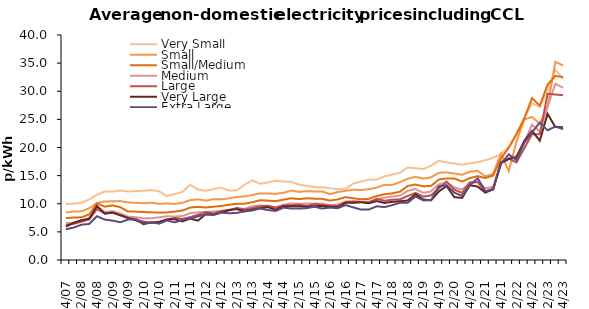
| Category | Very Small | Small | Small/Medium | Medium | Large | Very Large | Extra Large |
|---|---|---|---|---|---|---|---|
| Q4/07  | 9.933 | 8.438 | 7.454 | 6.574 | 6.184 | 5.956 | 5.476 |
| Q1/08  | 10.021 | 8.605 | 7.549 | 6.615 | 6.438 | 6.609 | 5.766 |
| Q2/08  | 10.173 | 8.651 | 7.588 | 7.026 | 6.809 | 7.068 | 6.275 |
| Q3/08  | 10.758 | 9.199 | 8.096 | 7.475 | 7.214 | 7.329 | 6.405 |
| Q4/08  | 11.603 | 10.126 | 10.065 | 9.495 | 9.032 | 9.582 | 7.785 |
| Q1/09  | 12.185 | 10.413 | 9.486 | 8.537 | 8.293 | 8.235 | 7.18 |
| Q2/09  | 12.177 | 10.43 | 9.697 | 8.672 | 8.45 | 8.422 | 7.002 |
| Q3/09  | 12.352 | 10.476 | 9.395 | 8.271 | 7.943 | 7.973 | 6.712 |
| Q4/09  | 12.183 | 10.22 | 8.617 | 7.713 | 7.479 | 7.469 | 7.181 |
| Q1/10  | 12.259 | 10.171 | 8.6 | 7.597 | 7.258 | 7.055 | 7.245 |
| Q2/10  | 12.301 | 10.091 | 8.524 | 7.412 | 6.803 | 6.511 | 6.333 |
| Q3/10  | 12.424 | 10.175 | 8.478 | 7.433 | 6.676 | 6.615 | 6.713 |
| Q4/10  | 12.228 | 9.99 | 8.435 | 7.576 | 6.761 | 6.768 | 6.461 |
| Q1/11  | 11.359 | 10.055 | 8.458 | 7.77 | 7.15 | 7.222 | 7.024 |
| Q2/11  | 11.741 | 9.97 | 8.612 | 7.737 | 7.481 | 7.25 | 6.695 |
| Q3/11  | 12.114 | 10.168 | 8.792 | 7.809 | 7.323 | 6.863 | 7.114 |
| Q4/11  | 13.371 | 10.64 | 9.32 | 8.335 | 7.624 | 7.357 | 7.388 |
| Q1/12  | 12.541 | 10.784 | 9.448 | 8.462 | 8.023 | 7.001 | 7.761 |
| Q2/12  | 12.29 | 10.551 | 9.341 | 8.527 | 8.55 | 8.156 | 8.083 |
| Q3/12  | 12.617 | 10.804 | 9.476 | 8.621 | 8.259 | 8.079 | 7.993 |
| Q4/12  | 12.852 | 10.803 | 9.604 | 8.777 | 8.665 | 8.446 | 8.426 |
| Q1/13  | 12.346 | 10.954 | 9.824 | 8.93 | 8.801 | 8.894 | 8.311 |
| Q2/13  | 12.379 | 11.208 | 10.012 | 9.131 | 9.266 | 9.038 | 8.378 |
| Q3/13  | 13.403 | 11.3 | 9.987 | 9.104 | 8.985 | 8.672 | 8.634 |
| Q4/13  | 14.157 | 11.562 | 10.287 | 9.551 | 9.209 | 8.942 | 8.808 |
| Q1/14  | 13.554 | 11.839 | 10.625 | 9.705 | 9.553 | 9.203 | 9.159 |
| Q2/14  | 13.778 | 11.83 | 10.554 | 9.555 | 9.648 | 9.391 | 8.867 |
| Q3/14  | 14.077 | 11.763 | 10.457 | 9.414 | 9.294 | 8.935 | 8.718 |
| Q4/14  | 13.961 | 11.941 | 10.722 | 9.789 | 9.689 | 9.549 | 9.31 |
| Q1/15  | 13.901 | 12.35 | 10.978 | 10.076 | 9.732 | 9.555 | 9.157 |
| Q2/15  | 13.407 | 12.102 | 10.823 | 9.995 | 9.842 | 9.545 | 9.133 |
| Q3/15  | 13.189 | 12.237 | 10.965 | 10.041 | 9.601 | 9.475 | 9.23 |
| Q4/15  | 12.963 | 12.177 | 10.909 | 10.049 | 9.951 | 9.573 | 9.463 |
| Q1/16  | 12.937 | 12.183 | 10.871 | 10.005 | 9.792 | 9.593 | 9.151 |
| Q2/16  | 12.755 | 11.714 | 10.565 | 9.718 | 9.672 | 9.445 | 9.314 |
| Q3/16  | 12.584 | 12.095 | 10.768 | 9.884 | 9.603 | 9.408 | 9.214 |
| Q4/16  | 12.689 | 12.297 | 11.173 | 10.412 | 10.261 | 10.164 | 9.759 |
| Q1/17  | 13.604 | 12.502 | 10.976 | 10.462 | 10.352 | 10.17 | 9.35 |
| Q2/17  | 13.928 | 12.436 | 10.784 | 10.311 | 10.329 | 10.257 | 8.957 |
| Q3/17  | 14.302 | 12.593 | 10.875 | 10.368 | 10.2 | 10.098 | 8.97 |
| Q4/17  | 14.274 | 12.863 | 11.363 | 10.796 | 10.876 | 10.469 | 9.548 |
| Q1/18  | 14.872 | 13.357 | 11.695 | 11.084 | 10.524 | 10.14 | 9.405 |
| Q2/18  | 15.2 | 13.328 | 11.845 | 11.286 | 10.728 | 10.34 | 9.745 |
| Q3/18  | 15.515 | 13.841 | 12.134 | 11.445 | 10.777 | 10.432 | 10.177 |
| Q4/18  | 16.445 | 14.444 | 13.176 | 12.306 | 11.383 | 10.584 | 10.186 |
| Q1/19  | 16.327 | 14.798 | 13.418 | 12.61 | 11.926 | 11.703 | 11.298 |
| Q2/19  | 16.156 | 14.485 | 13.096 | 11.947 | 11.27 | 10.755 | 10.596 |
| Q3/19  | 16.767 | 14.698 | 13.18 | 12.195 | 11.494 | 10.611 | 10.612 |
| Q4/19  | 17.648 | 15.512 | 14.302 | 13.453 | 12.727 | 12.175 | 13.106 |
| Q1/20  | 17.342 | 15.58 | 14.509 | 13.795 | 13.947 | 13.159 | 13.303 |
| Q2/20  | 17.143 | 15.385 | 14.506 | 12.886 | 12.506 | 11.166 | 11.975 |
| Q3/20  | 16.937 | 15.146 | 13.951 | 12.528 | 11.93 | 11.042 | 11.383 |
| Q4/20  | 17.172 | 15.7 | 14.562 | 13.712 | 13.813 | 13.294 | 13.307 |
| Q1/21  | 17.414 | 15.845 | 14.909 | 13.843 | 13.857 | 13.048 | 14.529 |
| Q2/21  | 17.743 | 14.854 | 14.574 | 12.717 | 12.085 | 11.967 | 12.227 |
| Q3/21  | 18.176 | 15.331 | 15.017 | 13.043 | 12.501 | 12.64 | 12.653 |
| Q4/21  | 18.843 | 18.893 | 18.042 | 17.219 | 17.439 | 17.219 | 17.074 |
| Q1/22  | 20.055 | 15.797 | 19.95 | 18.089 | 18.012 | 17.947 | 18.784 |
| Q2/22  | 22.424 | 21.049 | 22.342 | 18.466 | 17.347 | 18.284 | 17.739 |
| Q3/22  | 25.268 | 24.988 | 25.151 | 20.939 | 19.863 | 21.174 | 20.847 |
| Q4/22  | 27.872 | 25.426 | 28.788 | 24.071 | 22.35 | 22.951 | 22.689 |
| Q1/23  | 27.246 | 24.221 | 27.431 | 22.812 | 22.345 | 21.212 | 24.439 |
| Q2/23  | 30.034 | 27.293 | 31.193 | 27.2 | 29.537 | 25.989 | 23.043 |
| Q3/23  | 33.822 | 35.237 | 32.707 | 31.317 | 29.427 | 23.635 | 23.738 |
| Q4/23  | 32.207 | 34.572 | 32.539 | 30.623 | 29.288 | 23.616 | 23.274 |